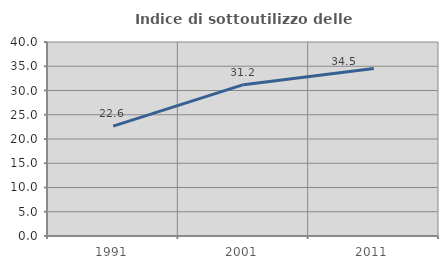
| Category | Indice di sottoutilizzo delle abitazioni  |
|---|---|
| 1991.0 | 22.647 |
| 2001.0 | 31.2 |
| 2011.0 | 34.517 |